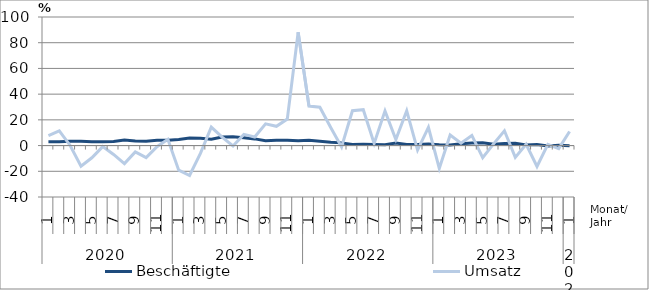
| Category | Beschäftigte | Umsatz |
|---|---|---|
| 0 | 2.9 | 7.8 |
| 1 | 2.9 | 11.5 |
| 2 | 3.4 | 0.1 |
| 3 | 3.4 | -16.1 |
| 4 | 2.9 | -9.5 |
| 5 | 2.9 | -0.8 |
| 6 | 3.1 | -6.9 |
| 7 | 4.3 | -14 |
| 8 | 3.6 | -4.9 |
| 9 | 3.4 | -9.4 |
| 10 | 4.1 | -0.9 |
| 11 | 4.1 | 4.9 |
| 12 | 4.8 | -19.1 |
| 13 | 5.8 | -23.3 |
| 14 | 5.6 | -6.1 |
| 15 | 5 | 14.4 |
| 16 | 6.6 | 6.6 |
| 17 | 6.9 | -0.3 |
| 18 | 6 | 8.7 |
| 19 | 5.2 | 6.7 |
| 20 | 3.8 | 16.9 |
| 21 | 4.2 | 15 |
| 22 | 4.2 | 20.6 |
| 23 | 3.7 | 88.1 |
| 24 | 4.1 | 30.7 |
| 25 | 3.4 | 29.8 |
| 26 | 2.6 | 14.1 |
| 27 | 2.1 | -1.1 |
| 28 | 0.9 | 27.1 |
| 29 | 1 | 27.9 |
| 30 | 0.8 | 1.7 |
| 31 | 0.7 | 27 |
| 32 | 2 | 4.7 |
| 33 | 0.9 | 27.1 |
| 34 | 0.9 | -3.5 |
| 35 | 1.2 | 14.1 |
| 36 | 0.6 | -17.8 |
| 37 | 0.5 | 8.2 |
| 38 | 1.4 | 1.9 |
| 39 | 2 | 7.9 |
| 40 | 2.2 | -9.4 |
| 41 | 1 | 1.3 |
| 42 | 1.6 | 11.5 |
| 43 | 1.8 | -9.2 |
| 44 | 0.4 | 1 |
| 45 | 0.8 | -16.3 |
| 46 | -0.3 | 0.9 |
| 47 | 0.2 | -2.4 |
| 48 | -0.1 | 11 |